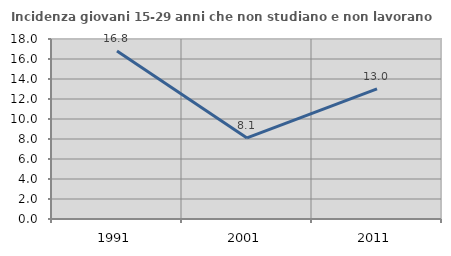
| Category | Incidenza giovani 15-29 anni che non studiano e non lavorano  |
|---|---|
| 1991.0 | 16.794 |
| 2001.0 | 8.108 |
| 2011.0 | 13.021 |